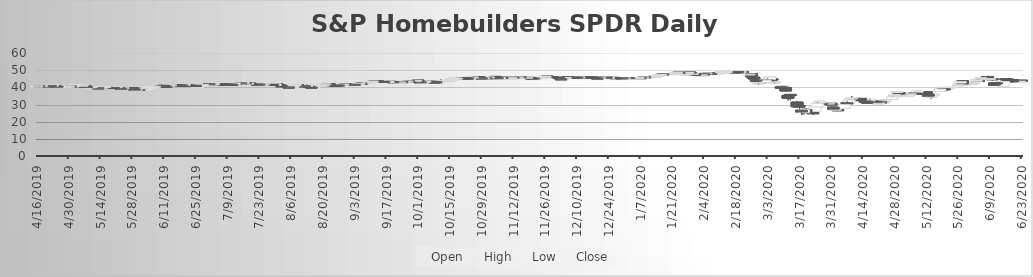
| Category | Open | High | Low | Close |
|---|---|---|---|---|
| 6/23/20 | 44.11 | 44.28 | 43.71 | 43.95 |
| 6/22/20 | 42.98 | 43.66 | 42.52 | 43.58 |
| 6/19/20 | 44.45 | 44.68 | 42.855 | 43.24 |
| 6/18/20 | 44.02 | 44.57 | 43.67 | 43.82 |
| 6/17/20 | 44.69 | 45.06 | 44.31 | 44.45 |
| 6/16/20 | 45.05 | 45.16 | 43.3 | 44.52 |
| 6/15/20 | 40.51 | 43.4 | 40.51 | 43.32 |
| 6/12/20 | 42.7 | 43.16 | 40.92 | 41.96 |
| 6/11/20 | 42.54 | 43.06 | 41.18 | 41.23 |
| 6/10/20 | 45.05 | 45.25 | 43.98 | 44.61 |
| 6/9/20 | 45.05 | 45.46 | 44.64 | 45.15 |
| 6/8/20 | 46.26 | 46.71 | 45.46 | 45.69 |
| 6/5/20 | 45.41 | 46.06 | 45.26 | 45.6 |
| 6/4/20 | 44 | 44.61 | 43.7 | 43.98 |
| 6/3/20 | 43.54 | 44.4 | 43.41 | 44.25 |
| 6/2/20 | 42.56 | 42.93 | 42.39 | 42.88 |
| 6/1/20 | 42.16 | 42.76 | 41.825 | 42.24 |
| 5/29/20 | 41.8 | 42.55 | 41.42 | 42.15 |
| 5/28/20 | 43.76 | 43.885 | 41.66 | 41.9 |
| 5/27/20 | 42.52 | 43.31 | 41.88 | 43.31 |
| 5/26/20 | 41.4 | 41.87 | 41.32 | 41.53 |
| 5/22/20 | 39.68 | 40.02 | 39.17 | 39.97 |
| 5/21/20 | 38.8 | 39.67 | 38.8 | 39.5 |
| 5/20/20 | 39.24 | 39.57 | 38.52 | 38.87 |
| 5/19/20 | 38.83 | 39.47 | 38.34 | 38.5 |
| 5/18/20 | 37.69 | 39.34 | 37.69 | 39 |
| 5/15/20 | 35.23 | 36.49 | 34.97 | 36.13 |
| 5/14/20 | 34.14 | 35.6 | 33.49 | 35.58 |
| 5/13/20 | 35.84 | 35.98 | 34.49 | 34.82 |
| 5/12/20 | 37.42 | 37.64 | 36.05 | 36.06 |
| 5/11/20 | 37.48 | 37.75 | 36.76 | 37.35 |
| 5/8/20 | 37.16 | 38.07 | 36.99 | 37.94 |
| 5/7/20 | 36.6 | 37.04 | 36.46 | 36.51 |
| 5/6/20 | 36.44 | 36.66 | 35.87 | 36.1 |
| 5/5/20 | 35.93 | 36.71 | 35.93 | 36.24 |
| 5/4/20 | 34.75 | 35.61 | 34.37 | 35.54 |
| 5/1/20 | 35.26 | 35.65 | 34.82 | 35.37 |
| 4/30/20 | 36.87 | 36.87 | 35.95 | 36.05 |
| 4/29/20 | 36.97 | 37.84 | 36.91 | 37.56 |
| 4/28/20 | 35.4 | 36.13 | 35.34 | 35.73 |
| 4/27/20 | 32.98 | 34.54 | 32.98 | 34.4 |
| 4/24/20 | 32 | 32.88 | 31.76 | 32.66 |
| 4/23/20 | 31.57 | 32.375 | 31.335 | 31.68 |
| 4/22/20 | 31.57 | 31.71 | 31.03 | 31.33 |
| 4/21/20 | 30.96 | 31.32 | 30.68 | 30.99 |
| 4/20/20 | 31.89 | 32.5 | 31.54 | 31.69 |
| 4/17/20 | 32.67 | 33.27 | 32.295 | 32.74 |
| 4/16/20 | 31.42 | 31.43 | 30.63 | 31.24 |
| 4/15/20 | 32.11 | 32.19 | 31.02 | 31.33 |
| 4/14/20 | 33.07 | 33.55 | 32.69 | 33.18 |
| 4/13/20 | 33.54 | 33.78 | 31.87 | 32.28 |
| 4/9/20 | 33.38 | 34.85 | 33.31 | 33.8 |
| 4/8/20 | 30.98 | 32.78 | 30.77 | 32.56 |
| 4/7/20 | 31.03 | 32.11 | 30.47 | 30.58 |
| 4/6/20 | 27.76 | 30.02 | 27.76 | 29.82 |
| 4/3/20 | 26.99 | 27.43 | 26.125 | 26.48 |
| 4/2/20 | 27.14 | 28.09 | 26.59 | 27.24 |
| 4/1/20 | 28.42 | 28.45 | 27.075 | 27.34 |
| 3/31/20 | 30.65 | 30.69 | 29.6 | 29.79 |
| 3/30/20 | 30.67 | 30.96 | 29.832 | 30.81 |
| 3/27/20 | 30.66 | 31.51 | 30.05 | 30.61 |
| 3/26/20 | 31 | 32.06 | 30.61 | 31.92 |
| 3/25/20 | 28.64 | 31.42 | 28.33 | 30.57 |
| 3/24/20 | 25.95 | 28.56 | 25.95 | 28.54 |
| 3/23/20 | 25.25 | 25.57 | 24.07 | 24.72 |
| 3/20/20 | 27.14 | 27.64 | 25.43 | 25.6 |
| 3/19/20 | 25.25 | 27.49 | 24.26 | 26.99 |
| 3/18/20 | 26.62 | 27.01 | 23.95 | 25.7 |
| 3/17/20 | 29.25 | 29.51 | 27.11 | 28.63 |
| 3/16/20 | 31.31 | 31.942 | 28.6 | 28.72 |
| 3/13/20 | 35.86 | 35.86 | 32.54 | 35.19 |
| 3/12/20 | 35.3 | 35.83 | 32.5 | 33.66 |
| 3/11/20 | 39.89 | 40.23 | 37.71 | 37.97 |
| 3/10/20 | 41 | 41.08 | 38.7 | 41.06 |
| 3/9/20 | 40.35 | 40.87 | 39.14 | 39.55 |
| 3/6/20 | 42.94 | 43.46 | 42.1 | 43.17 |
| 3/5/20 | 44.87 | 45.29 | 43.99 | 44.33 |
| 3/4/20 | 44.64 | 46 | 44.46 | 45.97 |
| 3/3/20 | 44.23 | 45.4 | 43.33 | 43.8 |
| 3/2/20 | 42.76 | 44.23 | 42.29 | 44.19 |
| 2/28/20 | 42.52 | 43.2 | 41.64 | 42.66 |
| 2/27/20 | 44.13 | 45.45 | 43.51 | 43.81 |
| 2/26/20 | 45.85 | 46.27 | 44.92 | 44.94 |
| 2/25/20 | 48.03 | 48.03 | 45.96 | 46.07 |
| 2/24/20 | 47.59 | 48.12 | 47.5 | 47.76 |
| 2/21/20 | 49.17 | 49.319 | 48.825 | 48.97 |
| 2/20/20 | 48.79 | 49.29 | 48.469 | 49.23 |
| 2/19/20 | 49.17 | 49.345 | 48.88 | 48.92 |
| 2/18/20 | 49.05 | 49.3 | 48.65 | 48.88 |
| 2/14/20 | 49.04 | 49.29 | 48.81 | 49.21 |
| 2/13/20 | 48.79 | 49.2 | 48.76 | 48.99 |
| 2/12/20 | 48.97 | 49.11 | 48.71 | 49.04 |
| 2/11/20 | 48.44 | 48.85 | 48.32 | 48.81 |
| 2/10/20 | 47.89 | 48.38 | 47.8 | 48.36 |
| 2/7/20 | 48.1 | 48.26 | 47.87 | 47.92 |
| 2/6/20 | 48.61 | 48.71 | 48.108 | 48.23 |
| 2/5/20 | 47.88 | 48.47 | 47.75 | 48.43 |
| 2/4/20 | 47.87 | 47.96 | 47.41 | 47.5 |
| 2/3/20 | 47.25 | 47.59 | 47.22 | 47.28 |
| 1/31/20 | 48.05 | 48.16 | 46.87 | 46.98 |
| 1/30/20 | 47.96 | 48.36 | 47.68 | 48.14 |
| 1/29/20 | 48.8 | 48.98 | 48.075 | 48.2 |
| 1/28/20 | 48.06 | 48.94 | 47.975 | 48.64 |
| 1/27/20 | 47.38 | 48.06 | 47.3 | 47.71 |
| 1/24/20 | 48.78 | 48.91 | 47.85 | 48.1 |
| 1/23/20 | 48.14 | 48.88 | 47.96 | 48.74 |
| 1/22/20 | 48.12 | 48.525 | 47.97 | 48.17 |
| 1/21/20 | 47.5 | 48.03 | 47.46 | 47.98 |
| 1/17/20 | 47.87 | 47.97 | 47.57 | 47.6 |
| 1/16/20 | 47.48 | 47.64 | 47.265 | 47.61 |
| 1/15/20 | 46.62 | 47.34 | 46.62 | 47.25 |
| 1/14/20 | 46.5 | 46.89 | 46.44 | 46.69 |
| 1/13/20 | 46.21 | 46.55 | 46.16 | 46.52 |
| 1/10/20 | 46.1 | 46.39 | 45.89 | 46.14 |
| 1/9/20 | 46.17 | 46.35 | 46 | 46.08 |
| 1/8/20 | 45.87 | 46.485 | 45.74 | 45.98 |
| 1/7/20 | 45.66 | 45.86 | 45.525 | 45.54 |
| 1/6/20 | 45.17 | 45.78 | 45.1 | 45.75 |
| 1/3/20 | 45.15 | 45.51 | 45.15 | 45.41 |
| 1/2/20 | 45.7 | 45.795 | 45.225 | 45.65 |
| 12/31/19 | 45.31 | 45.66 | 45.27 | 45.51 |
| 12/30/19 | 45.54 | 45.6 | 45.19 | 45.44 |
| 12/27/19 | 45.64 | 45.75 | 45.5 | 45.55 |
| 12/26/19 | 45.78 | 45.78 | 45.35 | 45.64 |
| 12/24/19 | 45.41 | 45.715 | 45.41 | 45.69 |
| 12/23/19 | 45.83 | 45.96 | 45.38 | 45.41 |
| 12/20/19 | 45.32 | 45.83 | 45.32 | 45.76 |
| 12/19/19 | 45.49 | 45.55 | 45.15 | 45.4 |
| 12/18/19 | 45.81 | 45.945 | 45.41 | 45.58 |
| 12/17/19 | 45.91 | 46.07 | 45.71 | 45.79 |
| 12/16/19 | 45.92 | 46.16 | 45.75 | 45.89 |
| 12/13/19 | 45.93 | 46.07 | 45.54 | 45.79 |
| 12/12/19 | 46 | 46.24 | 45.85 | 45.92 |
| 12/11/19 | 45.57 | 46.04 | 45.45 | 46 |
| 12/10/19 | 45.84 | 45.87 | 45.476 | 45.6 |
| 12/9/19 | 45.89 | 46.1 | 45.73 | 45.87 |
| 12/6/19 | 46.19 | 46.26 | 45.91 | 45.99 |
| 12/5/19 | 45.37 | 45.84 | 45.37 | 45.79 |
| 12/4/19 | 45.04 | 45.55 | 45.04 | 45.34 |
| 12/3/19 | 45.01 | 45.03 | 44.68 | 44.95 |
| 12/2/19 | 45.85 | 45.92 | 45.26 | 45.3 |
| 11/29/19 | 46.29 | 46.31 | 45.86 | 45.92 |
| 11/27/19 | 46.5 | 46.675 | 46.25 | 46.3 |
| 11/26/19 | 45.82 | 46.43 | 45.82 | 46.42 |
| 11/25/19 | 45.35 | 45.8 | 45.35 | 45.73 |
| 11/22/19 | 45.14 | 45.315 | 45.055 | 45.24 |
| 11/21/19 | 45.42 | 45.57 | 45.08 | 45.09 |
| 11/20/19 | 45.41 | 45.797 | 45.16 | 45.39 |
| 11/19/19 | 45.8 | 45.915 | 45.37 | 45.38 |
| 11/18/19 | 45.69 | 46.03 | 45.69 | 45.88 |
| 11/15/19 | 46.14 | 46.21 | 45.59 | 45.68 |
| 11/14/19 | 45.66 | 46.1 | 45.66 | 45.97 |
| 11/13/19 | 45.57 | 45.87 | 45.55 | 45.78 |
| 11/12/19 | 45.82 | 45.98 | 45.34 | 45.74 |
| 11/11/19 | 45.03 | 45.61 | 45.02 | 45.59 |
| 11/8/19 | 45.1 | 45.335 | 45.03 | 45.22 |
| 11/7/19 | 45.85 | 45.921 | 45.08 | 45.17 |
| 11/6/19 | 45.52 | 45.71 | 45.17 | 45.68 |
| 11/5/19 | 45.65 | 45.74 | 45.255 | 45.45 |
| 11/4/19 | 46.34 | 46.44 | 45.55 | 45.71 |
| 11/1/19 | 45.78 | 46.09 | 45.6 | 46.07 |
| 10/31/19 | 45.61 | 45.67 | 45.2 | 45.53 |
| 10/30/19 | 45.36 | 45.62 | 44.81 | 45.56 |
| 10/29/19 | 45.49 | 45.87 | 45.38 | 45.43 |
| 10/28/19 | 46.15 | 46.28 | 45.642 | 45.68 |
| 10/25/19 | 45.89 | 46.48 | 45.77 | 46 |
| 10/24/19 | 45.54 | 45.81 | 45.5 | 45.75 |
| 10/23/19 | 45.5 | 45.71 | 45.17 | 45.39 |
| 10/22/19 | 45.7 | 45.83 | 45.28 | 45.57 |
| 10/21/19 | 45.57 | 45.865 | 45.31 | 45.4 |
| 10/18/19 | 45.03 | 45.515 | 45.03 | 45.42 |
| 10/17/19 | 45 | 45.4 | 45 | 45.26 |
| 10/16/19 | 44.48 | 44.88 | 44.374 | 44.84 |
| 10/15/19 | 44.18 | 44.56 | 44.1 | 44.48 |
| 10/14/19 | 43.87 | 44.076 | 43.79 | 43.96 |
| 10/11/19 | 43.88 | 44.46 | 43.84 | 43.95 |
| 10/10/19 | 43.23 | 43.46 | 43.04 | 43.35 |
| 10/9/19 | 43.28 | 43.35 | 42.98 | 43.16 |
| 10/8/19 | 43.23 | 43.54 | 42.97 | 43.01 |
| 10/7/19 | 43.51 | 43.71 | 43.3 | 43.45 |
| 10/4/19 | 42.99 | 43.61 | 42.99 | 43.59 |
| 10/3/19 | 42.72 | 42.97 | 42.18 | 42.9 |
| 10/2/19 | 43.22 | 43.29 | 42.385 | 42.76 |
| 10/1/19 | 44.18 | 44.48 | 43.43 | 43.47 |
| 9/30/19 | 43.72 | 44.21 | 43.68 | 44.08 |
| 9/27/19 | 43.81 | 43.86 | 43.32 | 43.54 |
| 9/26/19 | 43.64 | 43.8 | 43.4 | 43.65 |
| 9/25/19 | 43.14 | 43.51 | 42.95 | 43.48 |
| 9/24/19 | 43.34 | 43.53 | 42.93 | 43.05 |
| 9/23/19 | 42.95 | 43.31 | 42.81 | 43.12 |
| 9/20/19 | 43.3 | 43.48 | 42.98 | 43.07 |
| 9/19/19 | 43.46 | 43.66 | 43.3 | 43.34 |
| 9/18/19 | 43.37 | 43.48 | 43.01 | 43.41 |
| 9/17/19 | 43.2 | 43.44 | 43.01 | 43.39 |
| 9/16/19 | 43.41 | 43.57 | 43.27 | 43.3 |
| 9/13/19 | 43.93 | 44.04 | 43.52 | 43.62 |
| 9/12/19 | 43.95 | 43.952 | 43.51 | 43.67 |
| 9/11/19 | 43.28 | 43.7 | 42.96 | 43.66 |
| 9/10/19 | 42.75 | 43.08 | 42.46 | 43.06 |
| 9/9/19 | 42.48 | 42.88 | 42.48 | 42.79 |
| 9/6/19 | 42.41 | 42.73 | 42.38 | 42.41 |
| 9/5/19 | 42.27 | 42.63 | 42.16 | 42.3 |
| 9/4/19 | 41.58 | 41.92 | 41.48 | 41.84 |
| 9/3/19 | 41.77 | 41.815 | 41.02 | 41.28 |
| 8/30/19 | 42.05 | 42.17 | 41.82 | 42.05 |
| 8/29/19 | 41.65 | 41.97 | 41.48 | 41.86 |
| 8/28/19 | 40.79 | 41.43 | 40.6 | 41.38 |
| 8/27/19 | 41.37 | 41.44 | 40.89 | 40.93 |
| 8/26/19 | 41.22 | 41.306 | 40.86 | 41.18 |
| 8/23/19 | 41.96 | 42.1 | 40.755 | 40.94 |
| 8/22/19 | 42.13 | 42.43 | 41.77 | 42.13 |
| 8/21/19 | 41.92 | 42.18 | 41.88 | 42.05 |
| 8/20/19 | 41.26 | 41.586 | 41.084 | 41.44 |
| 8/19/19 | 40.92 | 41.44 | 40.92 | 41.25 |
| 8/16/19 | 40.2 | 40.664 | 40.17 | 40.61 |
| 8/15/19 | 40.19 | 40.24 | 39.82 | 40.05 |
| 8/14/19 | 40.62 | 40.62 | 39.891 | 40.05 |
| 8/13/19 | 40.55 | 41.58 | 40.374 | 41.16 |
| 8/12/19 | 40.92 | 40.92 | 40.46 | 40.56 |
| 8/9/19 | 41.56 | 41.56 | 41.02 | 41.1 |
| 8/8/19 | 41.24 | 41.68 | 41.09 | 41.63 |
| 8/7/19 | 40.29 | 41.14 | 40.05 | 41.04 |
| 8/6/19 | 40.31 | 40.765 | 40.152 | 40.7 |
| 8/5/19 | 40.25 | 40.42 | 39.73 | 40.14 |
| 8/2/19 | 40.93 | 41.09 | 40.73 | 40.9 |
| 8/1/19 | 41.65 | 42.185 | 41.06 | 41.11 |
| 7/31/19 | 41.95 | 42.32 | 41.29 | 41.65 |
| 7/30/19 | 41.06 | 42.115 | 41.03 | 41.99 |
| 7/29/19 | 41.66 | 41.75 | 41.055 | 41.22 |
| 7/26/19 | 41.75 | 41.85 | 41.51 | 41.66 |
| 7/25/19 | 41.79 | 42.22 | 41.687 | 41.98 |
| 7/24/19 | 41.17 | 41.735 | 41.12 | 41.68 |
| 7/23/19 | 41.83 | 41.91 | 41.18 | 41.48 |
| 7/22/19 | 41.86 | 42.1 | 41.64 | 41.7 |
| 7/19/19 | 42.38 | 42.59 | 41.97 | 41.97 |
| 7/18/19 | 42.33 | 42.47 | 42.12 | 42.37 |
| 7/17/19 | 42.76 | 42.87 | 42.39 | 42.42 |
| 7/16/19 | 42.42 | 42.905 | 42.36 | 42.82 |
| 7/15/19 | 42.61 | 42.71 | 42.21 | 42.47 |
| 7/12/19 | 41.82 | 42.59 | 41.82 | 42.52 |
| 7/11/19 | 41.83 | 41.9 | 41.4 | 41.75 |
| 7/10/19 | 41.92 | 42 | 41.515 | 41.8 |
| 7/9/19 | 41.77 | 41.87 | 41.45 | 41.63 |
| 7/8/19 | 41.93 | 42.12 | 41.77 | 41.92 |
| 7/5/19 | 42.12 | 42.194 | 41.61 | 42.07 |
| 7/3/19 | 42.18 | 42.4 | 41.96 | 42.34 |
| 7/2/19 | 41.97 | 42.02 | 41.67 | 42.02 |
| 7/1/19 | 42.13 | 42.37 | 41.703 | 42.02 |
| 6/28/19 | 41.31 | 41.79 | 41.27 | 41.68 |
| 6/27/19 | 40.84 | 41.24 | 40.71 | 41.2 |
| 6/26/19 | 40.56 | 40.75 | 40.24 | 40.58 |
| 6/25/19 | 41.18 | 41.27 | 40.35 | 40.48 |
| 6/24/19 | 41.1 | 41.29 | 40.93 | 40.97 |
| 6/21/19 | 41.46 | 41.49 | 41.01 | 41.1 |
| 6/20/19 | 41.42 | 41.68 | 41.03 | 41.6 |
| 6/19/19 | 41.37 | 41.42 | 40.73 | 41.13 |
| 6/18/19 | 41.42 | 41.835 | 41.19 | 41.36 |
| 6/17/19 | 41.57 | 41.608 | 41.05 | 41.17 |
| 6/14/19 | 41.3 | 41.53 | 41.11 | 41.47 |
| 6/13/19 | 40.95 | 41.34 | 40.95 | 41.34 |
| 6/12/19 | 40.71 | 40.95 | 40.61 | 40.65 |
| 6/11/19 | 41.16 | 41.28 | 40.38 | 40.69 |
| 6/10/19 | 40.91 | 41.22 | 40.76 | 40.86 |
| 6/7/19 | 40.52 | 40.88 | 40.48 | 40.68 |
| 6/6/19 | 40.34 | 40.54 | 40 | 40.43 |
| 6/5/19 | 40.26 | 40.35 | 39.76 | 40.32 |
| 6/4/19 | 39.25 | 40.1 | 39.25 | 40.08 |
| 6/3/19 | 38.4 | 39.22 | 38.37 | 38.91 |
| 5/31/19 | 38.74 | 38.74 | 38.19 | 38.36 |
| 5/30/19 | 38.78 | 39.16 | 38.6 | 38.94 |
| 5/29/19 | 39.04 | 39.07 | 38.518 | 38.67 |
| 5/28/19 | 39.83 | 39.93 | 39.18 | 39.18 |
| 5/24/19 | 39.48 | 39.8 | 39.48 | 39.77 |
| 5/23/19 | 39.57 | 39.64 | 39.14 | 39.26 |
| 5/22/19 | 39.93 | 40.205 | 39.69 | 39.8 |
| 5/21/19 | 39.79 | 40.435 | 39.67 | 40.38 |
| 5/20/19 | 39.88 | 40 | 39.54 | 39.65 |
| 5/17/19 | 40.13 | 40.56 | 39.98 | 40.04 |
| 5/16/19 | 40.41 | 40.67 | 40.295 | 40.5 |
| 5/15/19 | 39.9 | 40.27 | 39.74 | 40.2 |
| 5/14/19 | 39.58 | 40.3 | 39.41 | 40.09 |
| 5/13/19 | 39.76 | 39.82 | 39.216 | 39.52 |
| 5/10/19 | 40.13 | 40.55 | 39.64 | 40.42 |
| 5/9/19 | 39.94 | 40.36 | 39.66 | 40.28 |
| 5/8/19 | 40.54 | 40.65 | 40.19 | 40.23 |
| 5/7/19 | 40.84 | 41.05 | 40.165 | 40.52 |
| 5/6/19 | 40.92 | 41.29 | 40.76 | 41.22 |
| 5/3/19 | 41.13 | 41.58 | 41.08 | 41.54 |
| 5/2/19 | 40.64 | 41.17 | 40.58 | 41.02 |
| 5/1/19 | 40.76 | 41.25 | 40.59 | 40.6 |
| 4/30/19 | 40.59 | 40.75 | 40.35 | 40.66 |
| 4/29/19 | 40.55 | 40.87 | 40.36 | 40.73 |
| 4/26/19 | 40.37 | 40.565 | 40.11 | 40.48 |
| 4/25/19 | 40.62 | 40.7 | 39.96 | 40.26 |
| 4/24/19 | 40.9 | 41.12 | 40.68 | 40.87 |
| 4/23/19 | 41.07 | 41.39 | 40.91 | 41.23 |
| 4/22/19 | 40.98 | 41.01 | 40.63 | 40.77 |
| 4/18/19 | 40.85 | 41.15 | 40.73 | 41.08 |
| 4/17/19 | 40.91 | 41.08 | 40.73 | 40.88 |
| 4/16/19 | 40.68 | 40.85 | 40.54 | 40.83 |